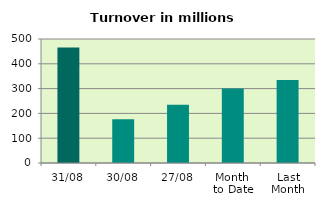
| Category | Series 0 |
|---|---|
| 31/08 | 465.706 |
| 30/08 | 176.668 |
| 27/08 | 234.478 |
| Month 
to Date | 300.77 |
| Last
Month | 334.97 |